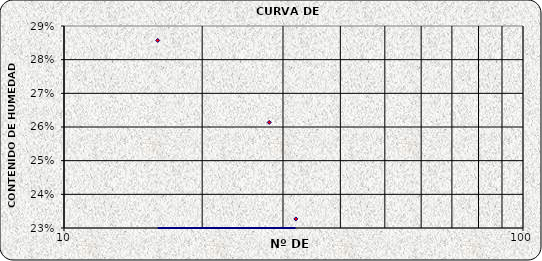
| Category | Series 0 |
|---|---|
| 32.0 | 0.233 |
| 28.0 | 0.261 |
| 16.0 | 0.286 |